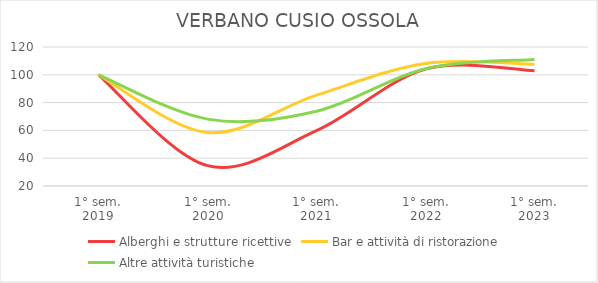
| Category | Alberghi e strutture ricettive | Bar e attività di ristorazione | Altre attività turistiche |
|---|---|---|---|
| 1° sem.
2019 | 100 | 100 | 100 |
| 1° sem.
2020 | 34.638 | 58.472 | 68.121 |
| 1° sem.
2021 | 59.784 | 85.337 | 73.826 |
| 1° sem.
2022 | 104.08 | 108.182 | 104.362 |
| 1° sem.
2023 | 102.914 | 107.676 | 111.074 |